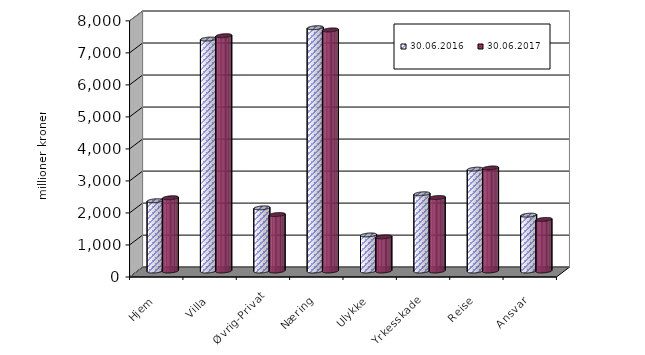
| Category | 30.06.2016 | 30.06.2017 |
|---|---|---|
| Hjem | 2194.609 | 2288.262 |
| Villa | 7244.942 | 7349.498 |
| Øvrig-Privat | 1972.036 | 1763.205 |
| Næring | 7598.501 | 7529.743 |
| Ulykke | 1125.785 | 1066.059 |
| Yrkesskade | 2411.739 | 2296.508 |
| Reise | 3181.323 | 3218.051 |
| Ansvar | 1743.522 | 1610.814 |